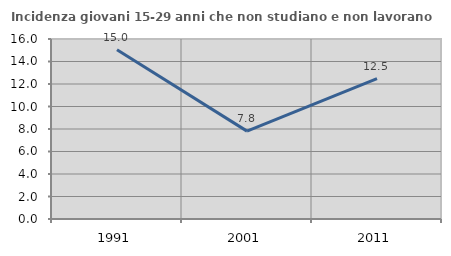
| Category | Incidenza giovani 15-29 anni che non studiano e non lavorano  |
|---|---|
| 1991.0 | 15.043 |
| 2001.0 | 7.81 |
| 2011.0 | 12.472 |